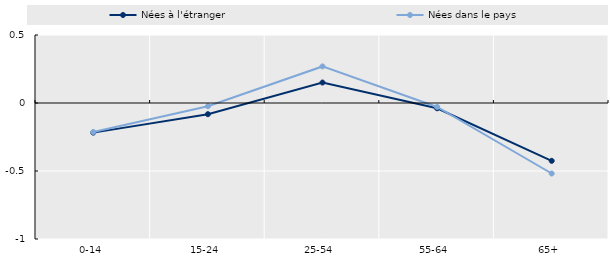
| Category | Nées à l'étranger | Nées dans le pays |
|---|---|---|
| 0-14 | -0.218 | -0.214 |
| 15-24 | -0.082 | -0.024 |
| 25-54 | 0.15 | 0.269 |
| 55-64 | -0.039 | -0.029 |
| 65+ | -0.425 | -0.518 |